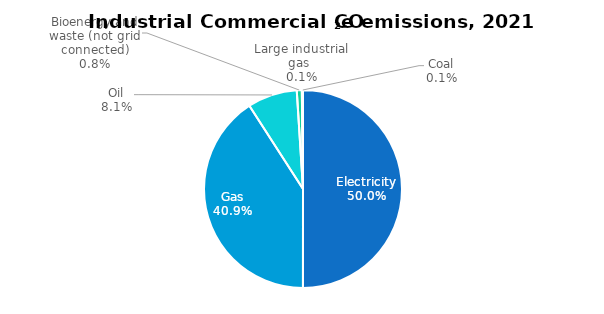
| Category | Series 0 |
|---|---|
| Electricity | 4.488 |
| Gas | 3.669 |
| Oil | 0.727 |
| Bioenergy and waste (not grid connected) | 0.073 |
| Large industrial gas  | 0.012 |
| Coal | 0.005 |